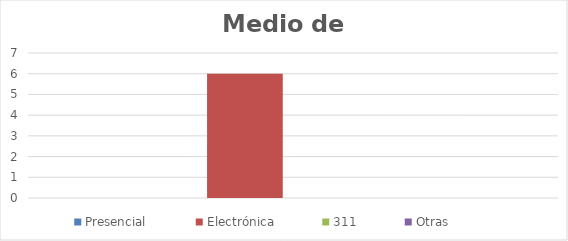
| Category | Presencial | Electrónica | 311 | Otras |
|---|---|---|---|---|
| 0 | 0 | 6 | 0 | 0 |